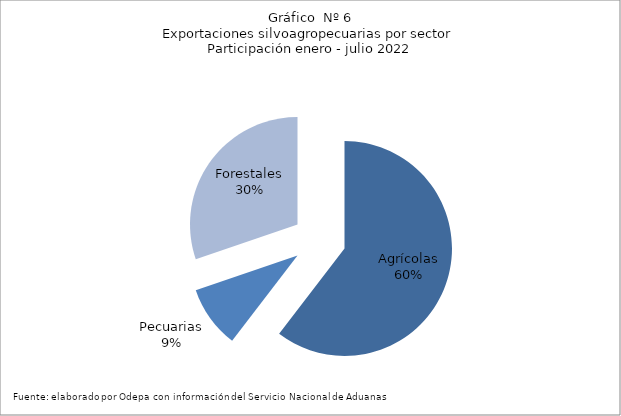
| Category | Series 0 |
|---|---|
| Agrícolas | 7173229 |
| Pecuarias | 1112132 |
| Forestales | 3589771 |